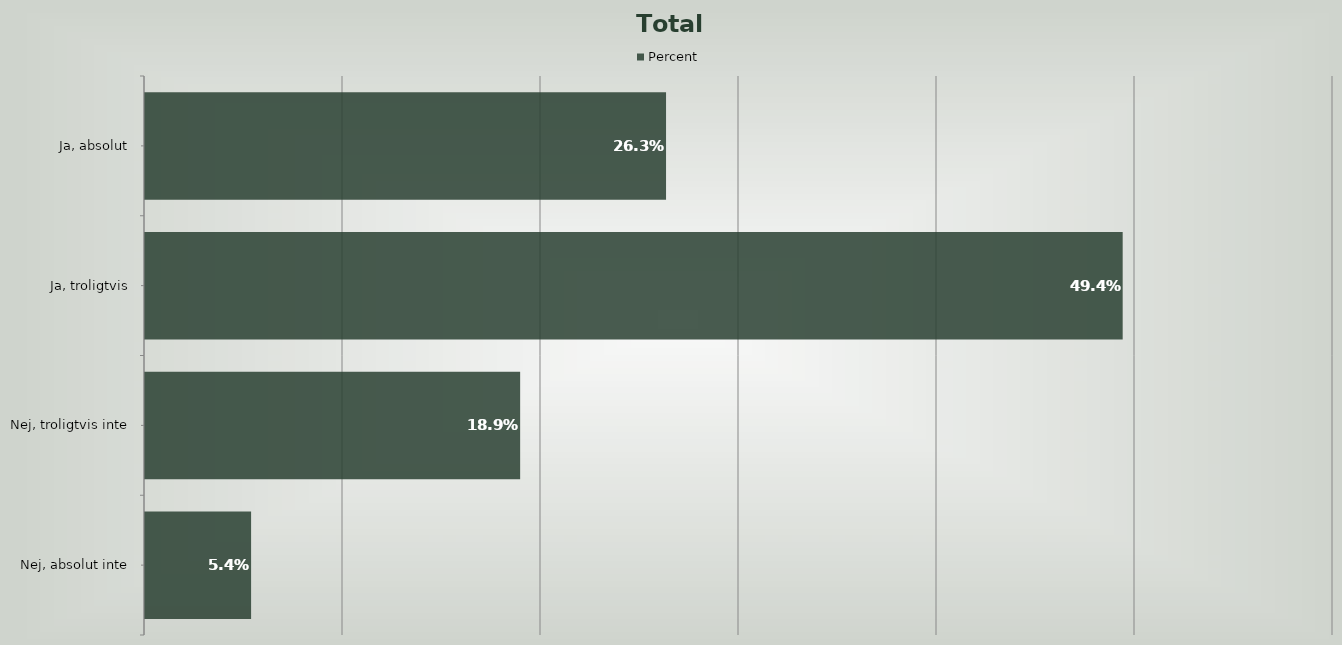
| Category | Percent |
|---|---|
| Ja, absolut | 0.263 |
| Ja, troligtvis | 0.494 |
| Nej, troligtvis inte | 0.189 |
| Nej, absolut inte | 0.054 |